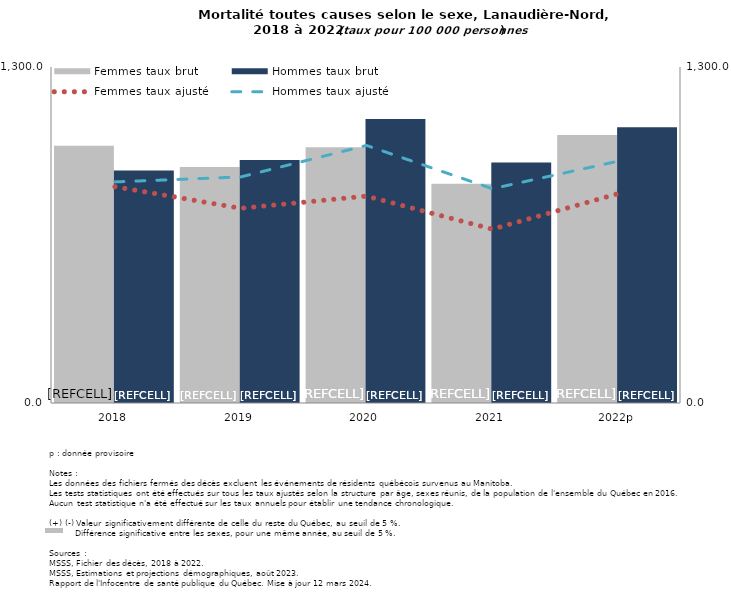
| Category | Femmes taux brut | Hommes taux brut |
|---|---|---|
| 2018 | 995 | 899.6 |
| 2019 | 913 | 939.9 |
| 2020 | 989.6 | 1098.4 |
| 2021 | 848.4 | 930.4 |
| 2022p | 1037.3 | 1066.7 |